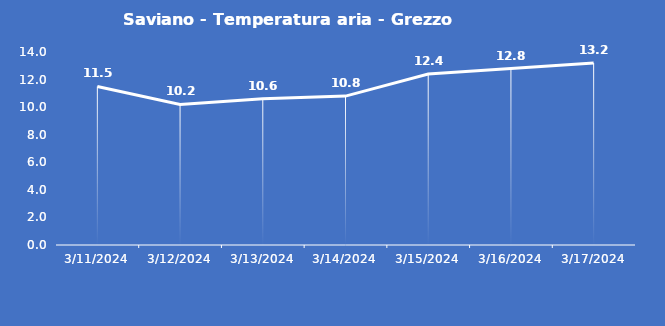
| Category | Saviano - Temperatura aria - Grezzo (°C) |
|---|---|
| 3/11/24 | 11.5 |
| 3/12/24 | 10.2 |
| 3/13/24 | 10.6 |
| 3/14/24 | 10.8 |
| 3/15/24 | 12.4 |
| 3/16/24 | 12.8 |
| 3/17/24 | 13.2 |